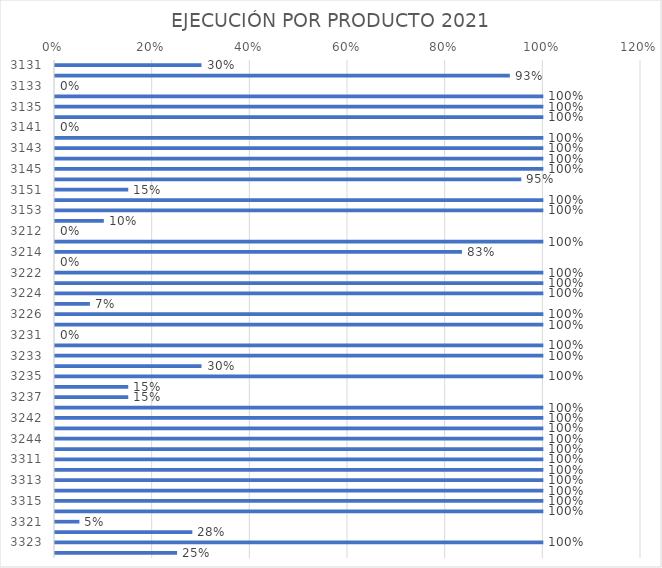
| Category | Series 0 |
|---|---|
| 3131.0 | 0.3 |
| 3132.0 | 0.931 |
| 3133.0 | 0 |
| 3134.0 | 1 |
| 3135.0 | 1 |
| 3136.0 | 1 |
| 3141.0 | 0 |
| 3142.0 | 1 |
| 3143.0 | 1 |
| 3144.0 | 1 |
| 3145.0 | 1 |
| 3146.0 | 0.955 |
| 3151.0 | 0.15 |
| 3152.0 | 1 |
| 3153.0 | 1 |
| 3211.0 | 0.1 |
| 3212.0 | 0 |
| 3213.0 | 1 |
| 3214.0 | 0.833 |
| 3221.0 | 0 |
| 3222.0 | 1 |
| 3223.0 | 1 |
| 3224.0 | 1 |
| 3225.0 | 0.071 |
| 3226.0 | 1 |
| 3227.0 | 1 |
| 3231.0 | 0 |
| 3232.0 | 1 |
| 3233.0 | 1 |
| 3234.0 | 0.3 |
| 3235.0 | 1 |
| 3236.0 | 0.15 |
| 3237.0 | 0.15 |
| 3241.0 | 1 |
| 3242.0 | 1 |
| 3243.0 | 1 |
| 3244.0 | 1 |
| 3245.0 | 1 |
| 3311.0 | 1 |
| 3312.0 | 1 |
| 3313.0 | 1 |
| 3314.0 | 1 |
| 3315.0 | 1 |
| 3316.0 | 1 |
| 3321.0 | 0.05 |
| 3322.0 | 0.281 |
| 3323.0 | 1 |
| 3324.0 | 0.25 |